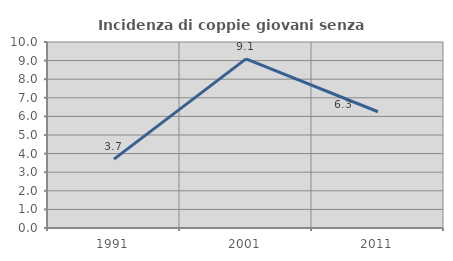
| Category | Incidenza di coppie giovani senza figli |
|---|---|
| 1991.0 | 3.704 |
| 2001.0 | 9.091 |
| 2011.0 | 6.25 |